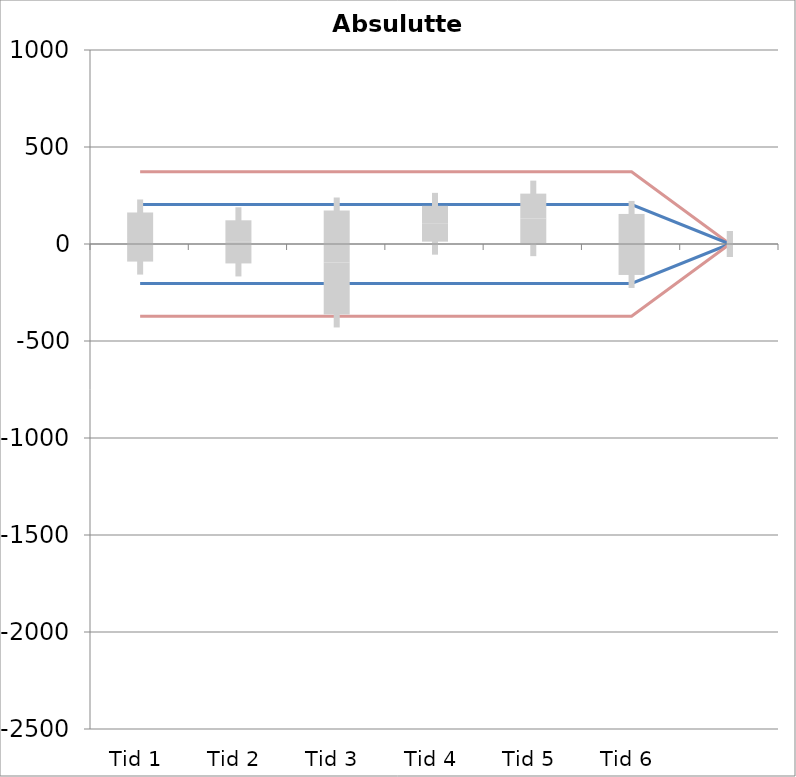
| Category | 1 | 2 | 3 | 4 | 5 | 6 | 7 | 8 | 9 | 10 | 11 | 12 | 13 | 14 | 15 | 16 | 17 | 18 | 19 | 20 | TEa | B | -B | -TEa | M |
|---|---|---|---|---|---|---|---|---|---|---|---|---|---|---|---|---|---|---|---|---|---|---|---|---|---|
| Tid 1 | 183.4 | 26.5 | 8.4 | -18.2 | 438 | -6 | -601.4 | 34.8 | -52.1 | 10 | 663 | -2.4 | -8.1 | 0 | 0 | 232 | -76 | -8 | 2.6 | -179.4 | 372.465 | 203.423 | -203.423 | -372.465 | 35.95 |
| Tid 2 | 300.8 | 20.6 | 1.1 | -21 | 375.9 | 11.2 | -456.1 | 21.9 | -103.5 | 10 | 675.8 | -3.9 | 1.3 | -213.3 | -34.2 | 36 | -58.9 | -0.6 | -3.5 | -339.3 | 372.465 | 203.423 | -203.423 | -372.465 | 11.015 |
| Tid 3 | -23.4 | -31.4 | -1.7 | -28.9 | -2305.2 | 11 | 0 | -1.2 | 5.6 | -8 | 264 | -9.6 | -29.1 | -180.8 | -18.4 | 557.9 | -35.4 | 8.1 | 4.3 | 11.6 | 372.465 | 203.423 | -203.423 | -372.465 | -95.295 |
| Tid 4 | 222.9 | 58.9 | 0 | -19.7 | 209.3 | 39.3 | 0 | 19.7 | -94.9 | 8.2 | 299.9 | -10.1 | -25 | 8.9 | 6.3 | 636 | 103 | 8 | -1.4 | 408.6 | 372.465 | 203.423 | -203.423 | -372.465 | 104.328 |
| Tid 5 | 123.4 | -3.4 | -1.4 | 0 | 348.1 | -0.4 | 0 | 30.6 | 37.6 | 8 | 649 | -2.1 | 0 | -129.1 | -23.7 | 774.2 | 91.3 | 22.4 | 8.2 | 310.6 | 372.465 | 203.423 | -203.423 | -372.465 | 131.959 |
| Tid 6 | 209.2 | 13 | 3.8 | 0 | -895.1 | 7.6 | 0 | 52.5 | 87.3 | 11.1 | 128.8 | -6.4 | 0 | -201.7 | -21.4 | 622.3 | 0 | 20.7 | 2.9 | -71.2 | 372.465 | 203.423 | -203.423 | -372.465 | -2.287 |